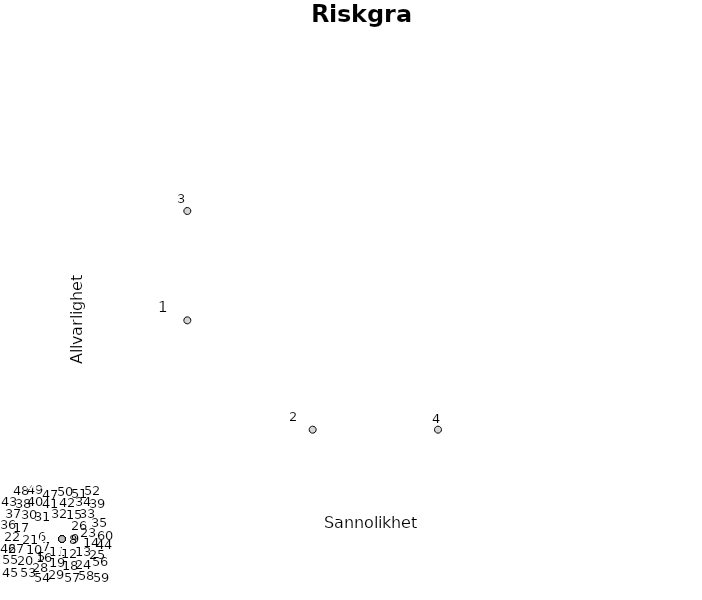
| Category | Risktal |
|---|---|
| 1.0 | 2 |
| 2.0 | 1 |
| 1.0 | 3 |
| 3.0 | 1 |
| 0.0 | 0 |
| 0.0 | 0 |
| 0.0 | 0 |
| 0.0 | 0 |
| 0.0 | 0 |
| 0.0 | 0 |
| 0.0 | 0 |
| 0.0 | 0 |
| 0.0 | 0 |
| 0.0 | 0 |
| 0.0 | 0 |
| 0.0 | 0 |
| 0.0 | 0 |
| 0.0 | 0 |
| 0.0 | 0 |
| 0.0 | 0 |
| 0.0 | 0 |
| 0.0 | 0 |
| 0.0 | 0 |
| 0.0 | 0 |
| 0.0 | 0 |
| 0.0 | 0 |
| 0.0 | 0 |
| 0.0 | 0 |
| 0.0 | 0 |
| 0.0 | 0 |
| 0.0 | 0 |
| 0.0 | 0 |
| 0.0 | 0 |
| 0.0 | 0 |
| 0.0 | 0 |
| 0.0 | 0 |
| 0.0 | 0 |
| 0.0 | 0 |
| 0.0 | 0 |
| 0.0 | 0 |
| 0.0 | 0 |
| 0.0 | 0 |
| 0.0 | 0 |
| 0.0 | 0 |
| 0.0 | 0 |
| 0.0 | 0 |
| 0.0 | 0 |
| 0.0 | 0 |
| 0.0 | 0 |
| 0.0 | 0 |
| 0.0 | 0 |
| 0.0 | 0 |
| 0.0 | 0 |
| 0.0 | 0 |
| 0.0 | 0 |
| 0.0 | 0 |
| 0.0 | 0 |
| 0.0 | 0 |
| 0.0 | 0 |
| 0.0 | 0 |